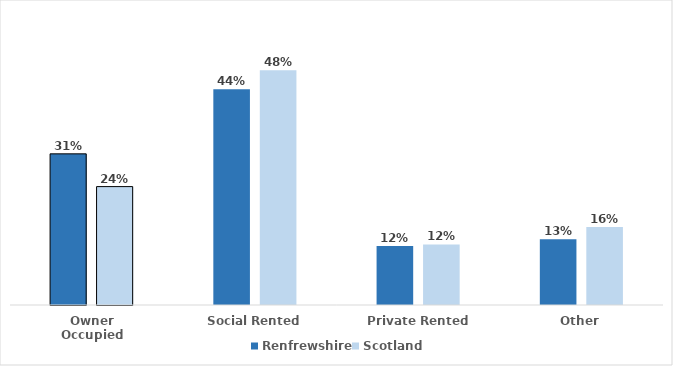
| Category | Renfrewshire | Scotland |
|---|---|---|
| Owner Occupied | 0.307 | 0.241 |
| Social Rented | 0.439 | 0.477 |
| Private Rented | 0.12 | 0.123 |
| Other | 0.134 | 0.159 |